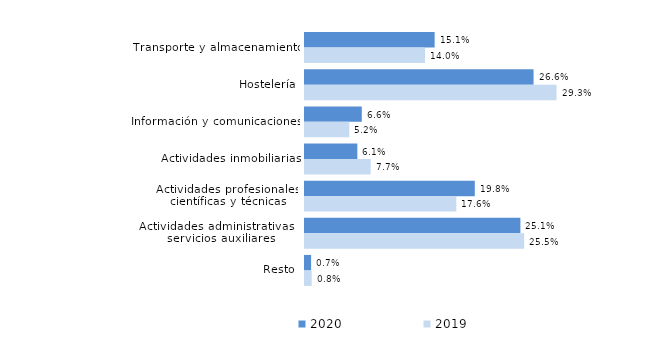
| Category | 2020 | 2019 |
|---|---|---|
| Transporte y almacenamiento | 0.151 | 0.14 |
| Hostelería | 0.266 | 0.293 |
| Información y comunicaciones | 0.066 | 0.052 |
| Actividades inmobiliarias | 0.061 | 0.077 |
| Actividades profesionales, científicas y técnicas | 0.198 | 0.176 |
| Actividades administrativas y servicios auxiliares | 0.251 | 0.255 |
| Resto | 0.007 | 0.008 |